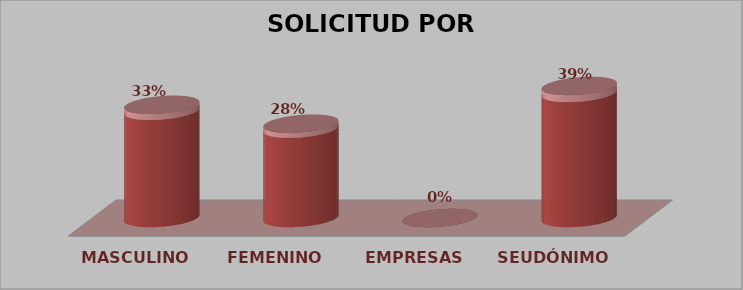
| Category | SOLICITUD POR GÉNERO | Series 1 |
|---|---|---|
| MASCULINO | 6 | 0.333 |
| FEMENINO | 5 | 0.278 |
| EMPRESAS | 0 | 0 |
| SEUDÓNIMO | 7 | 0.389 |